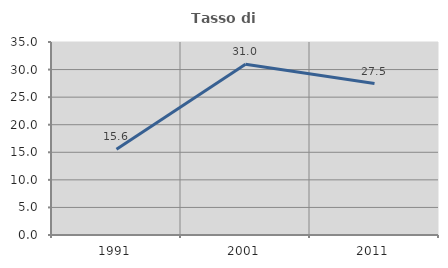
| Category | Tasso di occupazione   |
|---|---|
| 1991.0 | 15.567 |
| 2001.0 | 30.954 |
| 2011.0 | 27.46 |